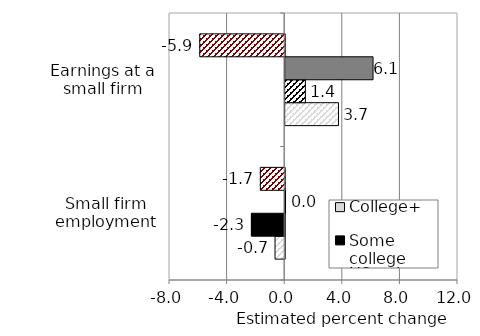
| Category | College+ | Some college | HS only | Less than HS |
|---|---|---|---|---|
| Small firm employment | -0.671 | -2.311 | 0.024 | -1.691 |
| Earnings at a small firm | 3.7 | 1.4 | 6.1 | -5.9 |